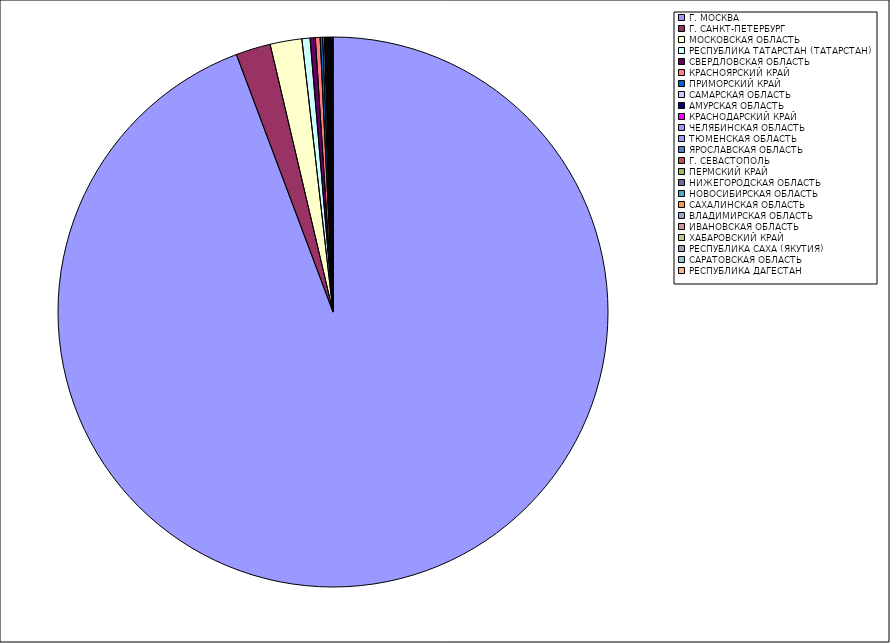
| Category | Оборот |
|---|---|
| Г. МОСКВА | 94.193 |
| Г. САНКТ-ПЕТЕРБУРГ | 2.038 |
| МОСКОВСКАЯ ОБЛАСТЬ | 1.863 |
| РЕСПУБЛИКА ТАТАРСТАН (ТАТАРСТАН) | 0.476 |
| СВЕРДЛОВСКАЯ ОБЛАСТЬ | 0.305 |
| КРАСНОЯРСКИЙ КРАЙ | 0.279 |
| ПРИМОРСКИЙ КРАЙ | 0.151 |
| САМАРСКАЯ ОБЛАСТЬ | 0.096 |
| АМУРСКАЯ ОБЛАСТЬ | 0.081 |
| КРАСНОДАРСКИЙ КРАЙ | 0.054 |
| ЧЕЛЯБИНСКАЯ ОБЛАСТЬ | 0.054 |
| ТЮМЕНСКАЯ ОБЛАСТЬ | 0.053 |
| ЯРОСЛАВСКАЯ ОБЛАСТЬ | 0.048 |
| Г. СЕВАСТОПОЛЬ | 0.036 |
| ПЕРМСКИЙ КРАЙ | 0.025 |
| НИЖЕГОРОДСКАЯ ОБЛАСТЬ | 0.024 |
| НОВОСИБИРСКАЯ ОБЛАСТЬ | 0.02 |
| САХАЛИНСКАЯ ОБЛАСТЬ | 0.018 |
| ВЛАДИМИРСКАЯ ОБЛАСТЬ | 0.016 |
| ИВАНОВСКАЯ ОБЛАСТЬ | 0.016 |
| ХАБАРОВСКИЙ КРАЙ | 0.016 |
| РЕСПУБЛИКА САХА (ЯКУТИЯ) | 0.015 |
| САРАТОВСКАЯ ОБЛАСТЬ | 0.014 |
| РЕСПУБЛИКА ДАГЕСТАН | 0.011 |